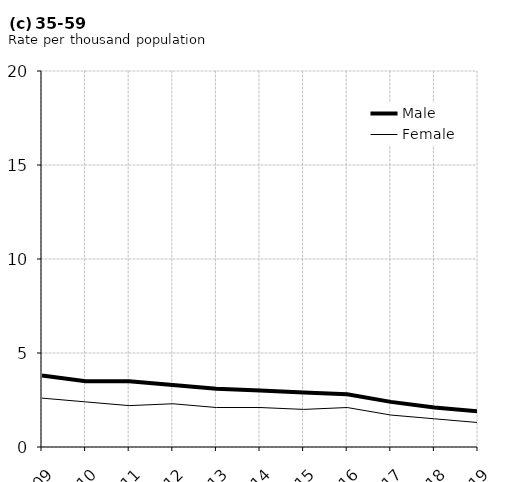
| Category | Male | Female |
|---|---|---|
| 2009.0 | 3.8 | 2.6 |
| 2010.0 | 3.5 | 2.4 |
| 2011.0 | 3.5 | 2.2 |
| 2012.0 | 3.3 | 2.3 |
| 2013.0 | 3.1 | 2.1 |
| 2014.0 | 3 | 2.1 |
| 2015.0 | 2.9 | 2 |
| 2016.0 | 2.8 | 2.1 |
| 2017.0 | 2.4 | 1.7 |
| 2018.0 | 2.1 | 1.5 |
| 2019.0 | 1.9 | 1.3 |